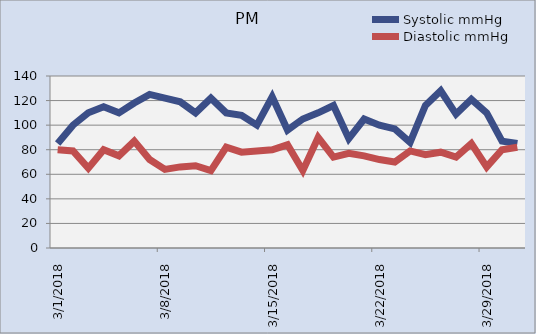
| Category | Systolic mmHg | Diastolic mmHg |
|---|---|---|
| 01/03/2018 | 85 | 80 |
| 02/03/2018 | 100 | 79 |
| 03/03/2018 | 110 | 65 |
| 04/03/2018 | 115 | 80 |
| 05/03/2018 | 110 | 75 |
| 06/03/2018 | 118 | 87 |
| 07/03/2018 | 125 | 72 |
| 08/03/2018 | 122 | 64 |
| 09/03/2018 | 119 | 66 |
| 10/03/2018 | 110 | 67 |
| 11/03/2018 | 122 | 63 |
| 12/03/2018 | 110 | 82 |
| 13/03/2018 | 108 | 78 |
| 14/03/2018 | 100 | 79 |
| 15/03/2018 | 123 | 80 |
| 16/03/2018 | 96 | 84 |
| 17/03/2018 | 105 | 63 |
| 18/03/2018 | 110 | 90 |
| 19/03/2018 | 116 | 74 |
| 20/03/2018 | 89 | 77 |
| 21/03/2018 | 105 | 75 |
| 22/03/2018 | 100 | 72 |
| 23/03/2018 | 97 | 70 |
| 24/03/2018 | 86 | 79 |
| 25/03/2018 | 116 | 76 |
| 26/03/2018 | 128 | 78 |
| 27/03/2018 | 109 | 74 |
| 28/03/2018 | 121 | 85 |
| 29/03/2018 | 110 | 66 |
| 30/03/2018 | 87 | 80 |
| 31/03/2018 | 85 | 82 |